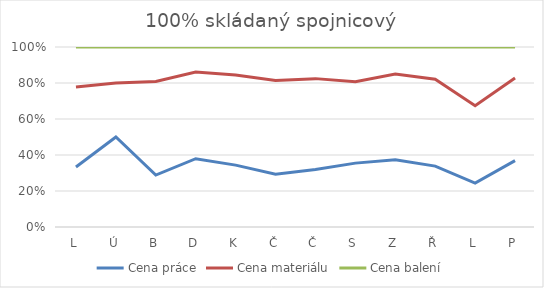
| Category | Cena práce | Cena materiálu | Cena balení |
|---|---|---|---|
| L | 300 | 400 | 200 |
| Ú | 500 | 300 | 200 |
| B | 220 | 396 | 146 |
| D | 500 | 634 | 184 |
| K | 350 | 509 | 159 |
| Č | 220 | 390 | 140 |
| Č | 200 | 316 | 110 |
| S | 220 | 280 | 120 |
| Z | 500 | 637 | 200 |
| Ř | 210 | 300 | 111 |
| L | 150 | 264 | 200 |
| P | 320 | 399 | 149 |